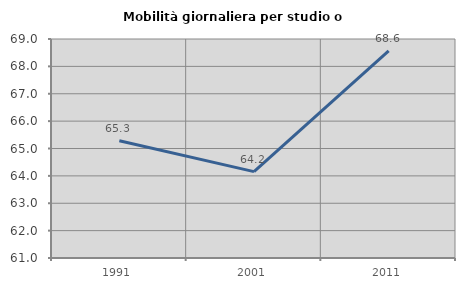
| Category | Mobilità giornaliera per studio o lavoro |
|---|---|
| 1991.0 | 65.283 |
| 2001.0 | 64.156 |
| 2011.0 | 68.567 |